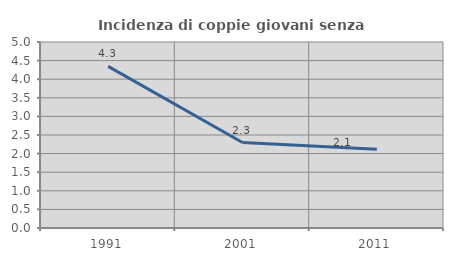
| Category | Incidenza di coppie giovani senza figli |
|---|---|
| 1991.0 | 4.344 |
| 2001.0 | 2.298 |
| 2011.0 | 2.116 |